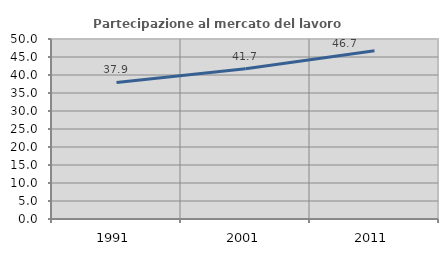
| Category | Partecipazione al mercato del lavoro  femminile |
|---|---|
| 1991.0 | 37.94 |
| 2001.0 | 41.731 |
| 2011.0 | 46.711 |